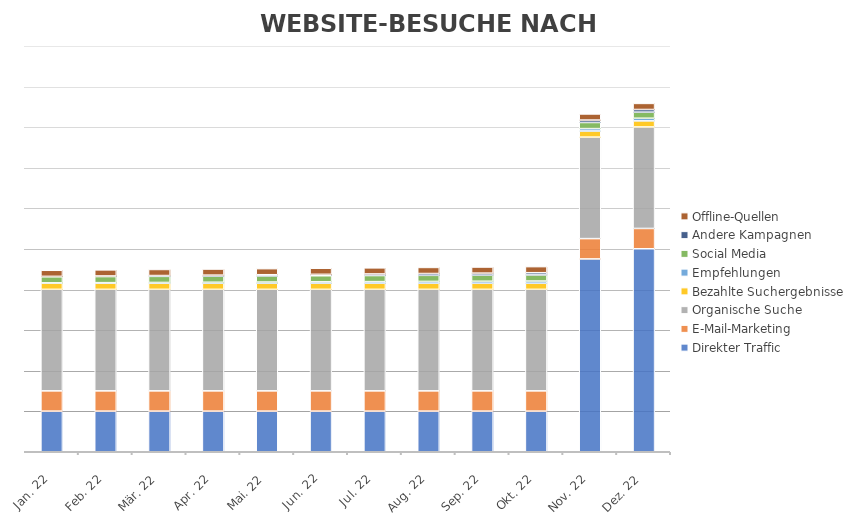
| Category | Direkter Traffic | E-Mail-Marketing | Organische Suche | Bezahlte Suchergebnisse | Empfehlungen | Social Media | Andere Kampagnen | Offline-Quellen |
|---|---|---|---|---|---|---|---|---|
| 2022-01-18 | 200 | 100 | 500 | 30 | 2 | 30 | 2 | 30 |
| 2022-02-18 | 200 | 100 | 500 | 30 | 3 | 30 | 3 | 30 |
| 2022-03-18 | 200 | 100 | 500 | 30 | 4 | 30 | 4 | 30 |
| 2022-04-18 | 200 | 100 | 500 | 30 | 5 | 30 | 5 | 30 |
| 2022-05-18 | 200 | 100 | 500 | 30 | 6 | 30 | 6 | 30 |
| 2022-06-18 | 200 | 100 | 500 | 30 | 7 | 30 | 7 | 30 |
| 2022-07-18 | 200 | 100 | 500 | 30 | 8 | 30 | 8 | 30 |
| 2022-08-18 | 200 | 100 | 500 | 30 | 9 | 30 | 9 | 30 |
| 2022-09-18 | 200 | 100 | 500 | 30 | 10 | 30 | 10 | 30 |
| 2022-10-18 | 200 | 100 | 500 | 30 | 11 | 30 | 11 | 30 |
| 2022-11-18 | 950 | 100 | 500 | 30 | 12 | 30 | 12 | 30 |
| 2022-12-18 | 1000 | 100 | 500 | 30 | 13 | 30 | 13 | 30 |